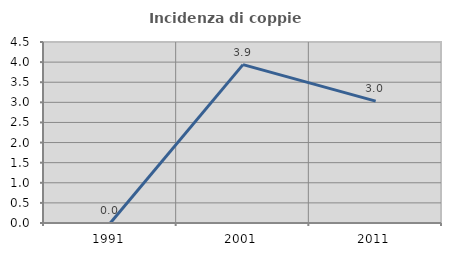
| Category | Incidenza di coppie miste |
|---|---|
| 1991.0 | 0 |
| 2001.0 | 3.937 |
| 2011.0 | 3.03 |